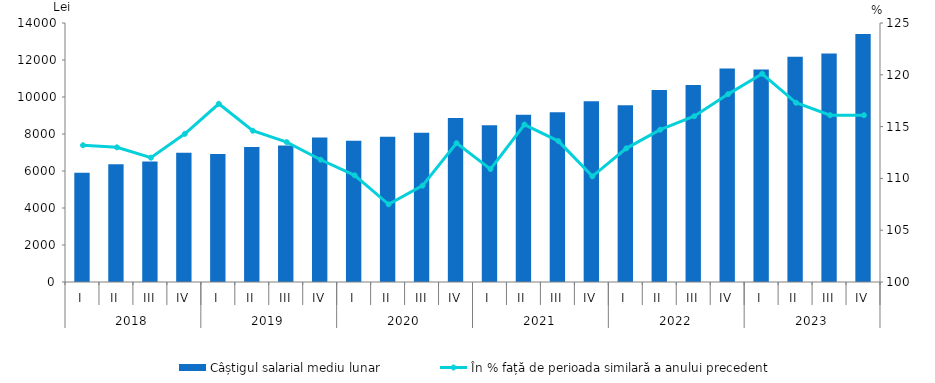
| Category | Câștigul salarial mediu lunar |
|---|---|
| 0 | 5906.5 |
| 1 | 6369.8 |
| 2 | 6507.3 |
| 3 | 6987.5 |
| 4 | 6923 |
| 5 | 7302.6 |
| 6 | 7385 |
| 7 | 7813.1 |
| 8 | 7633.9 |
| 9 | 7849 |
| 10 | 8074.3 |
| 11 | 8859.9 |
| 12 | 8468.6 |
| 13 | 9044.5 |
| 14 | 9175.7 |
| 15 | 9767.6 |
| 16 | 9560.8 |
| 17 | 10376.2 |
| 18 | 10648.1 |
| 19 | 11539.1 |
| 20 | 11486.2 |
| 21 | 12175.9 |
| 22 | 12357.2 |
| 23 | 13401.1 |